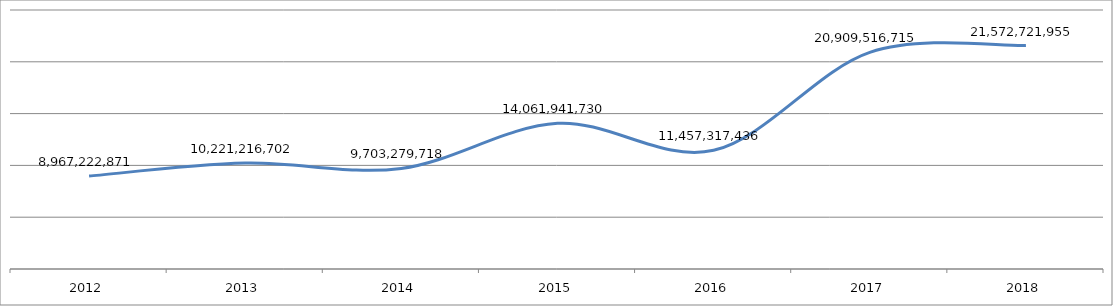
| Category | Series 0 |
|---|---|
| 2012 | 8967222871 |
| 2013 | 10221216702 |
| 2014 | 9703279718 |
| 2015 | 14061941730 |
| 2016 | 11457317436 |
| 2017 | 20909516715 |
| 2018 | 21572721955 |